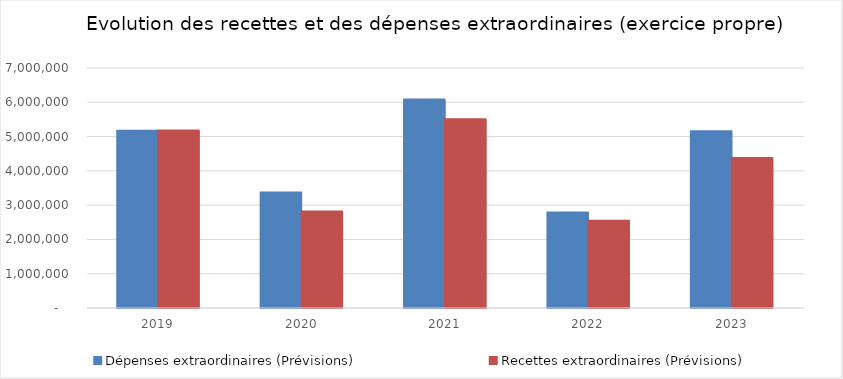
| Category | Dépenses extraordinaires (Prévisions) | Recettes extraordinaires (Prévisions) |
|---|---|---|
| 2019.0 | 5157681 | 5160338.75 |
| 2020.0 | 3352283.56 | 2802344.71 |
| 2021.0 | 6065801.77 | 5493035.88 |
| 2022.0 | 2769609.14 | 2529701.6 |
| 2023.0 | 5138921.02 | 4358100 |